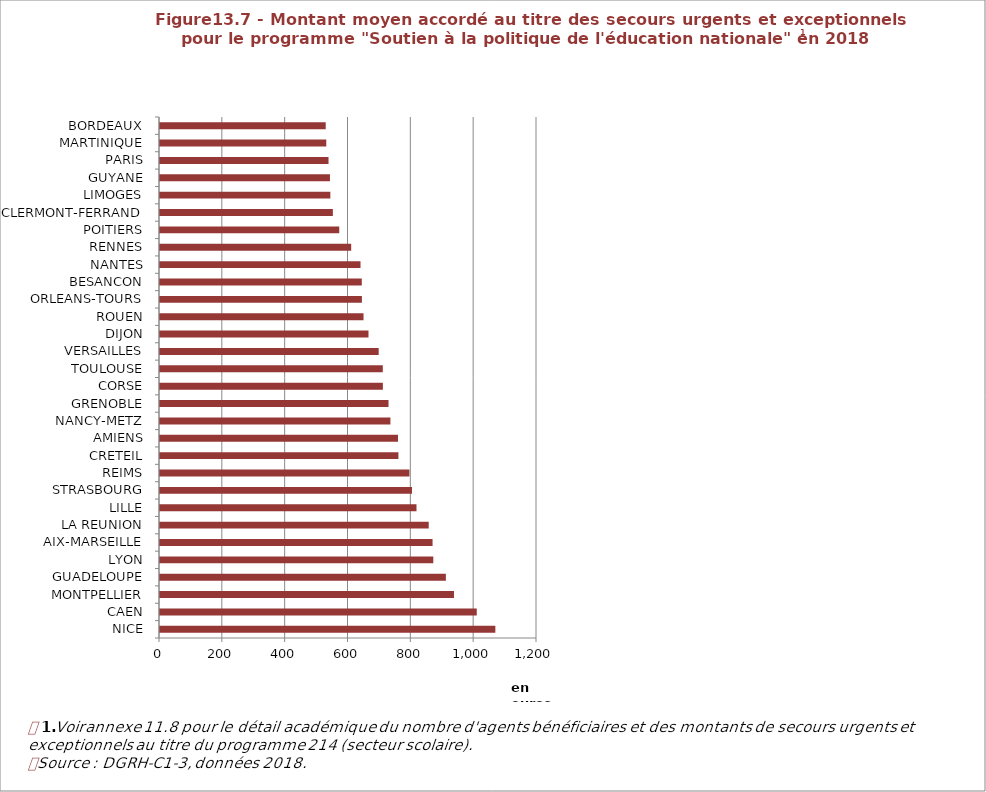
| Category | Programme 214 "Soutien à la politique de l'éducation nationale" |
|---|---|
| NICE | 1070.61 |
| CAEN | 1011.44 |
| MONTPELLIER | 938.94 |
| GUADELOUPE | 913.11 |
| LYON | 873.11 |
| AIX-MARSEILLE | 870.75 |
| LA REUNION | 858.54 |
| LILLE | 819.58 |
| STRASBOURG | 805.29 |
| REIMS | 797.13 |
| CRETEIL | 762.12 |
| AMIENS | 760.78 |
| NANCY-METZ | 736.6 |
| GRENOBLE | 730.56 |
| CORSE | 712.62 |
| TOULOUSE | 712.36 |
| VERSAILLES | 699.26 |
| DIJON | 666.86 |
| ROUEN | 651.02 |
| ORLEANS-TOURS | 645.84 |
| BESANCON | 645.49 |
| NANTES | 641.4 |
| RENNES | 611.73 |
| POITIERS | 573.71 |
| CLERMONT-FERRAND | 553.37 |
| LIMOGES | 545.41 |
| GUYANE | 544.19 |
| PARIS | 539.6 |
| MARTINIQUE | 532.46 |
| BORDEAUX | 530.66 |